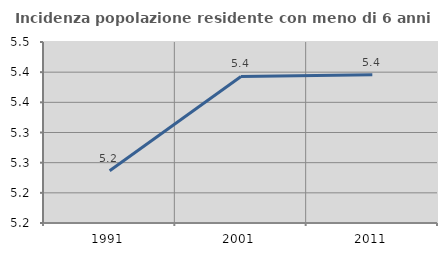
| Category | Incidenza popolazione residente con meno di 6 anni |
|---|---|
| 1991.0 | 5.237 |
| 2001.0 | 5.393 |
| 2011.0 | 5.396 |